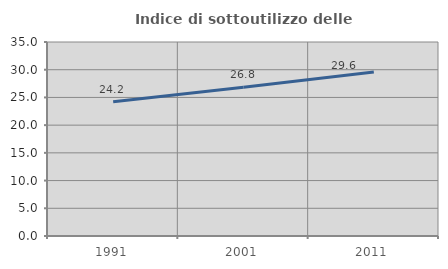
| Category | Indice di sottoutilizzo delle abitazioni  |
|---|---|
| 1991.0 | 24.2 |
| 2001.0 | 26.833 |
| 2011.0 | 29.58 |